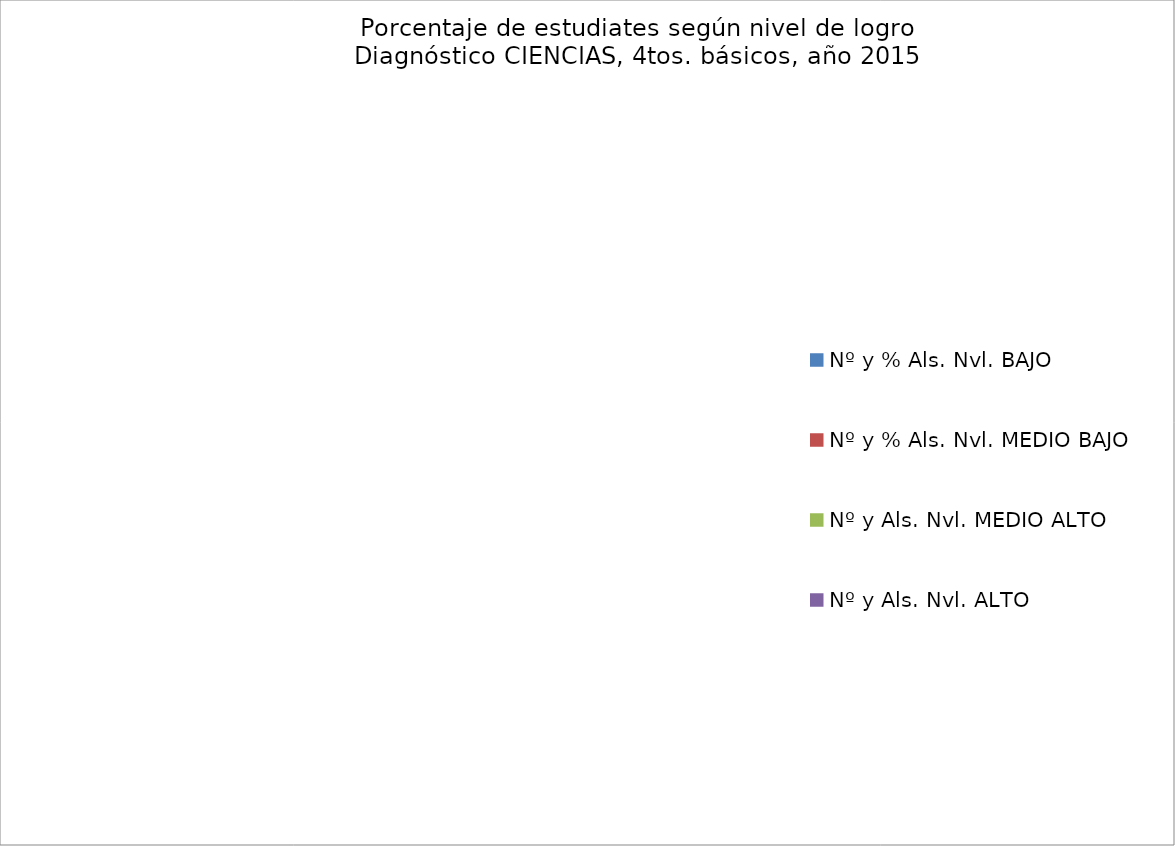
| Category | Series 0 |
|---|---|
| Nº y % Als. Nvl. BAJO | 0 |
| Nº y % Als. Nvl. MEDIO BAJO | 0 |
| Nº y Als. Nvl. MEDIO ALTO | 0 |
| Nº y Als. Nvl. ALTO | 0 |